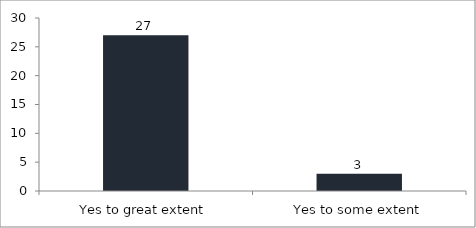
| Category | Q3. Do you think that the session was relevant to the need of the era? |
|---|---|
| Yes to great extent | 27 |
| Yes to some extent | 3 |